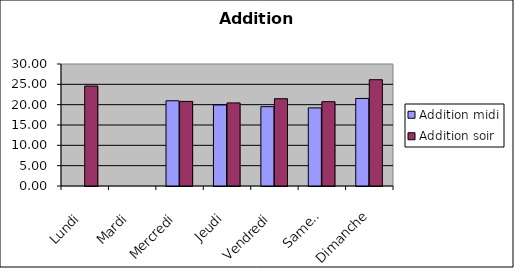
| Category | Addition |
|---|---|
| Lundi | 24.582 |
| Mardi | 0 |
| Mercredi | 20.8 |
| Jeudi | 20.43 |
| Vendredi | 21.46 |
| Samedi | 20.725 |
| Dimanche | 26.137 |